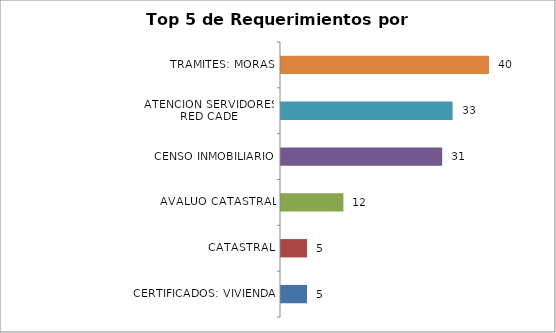
| Category | Total |
|---|---|
| CERTIFICADOS: VIVIENDA, CATASTRAL | 5 |
| AVALUO CATASTRAL | 5 |
| CENSO INMOBILIARIO | 12 |
| ATENCION SERVIDORES RED CADE | 31 |
| TRAMITES: MORAS, PRIORIDADES | 33 |
| ATENCION Y SERVICIO A LA CIUDADANIA | 40 |